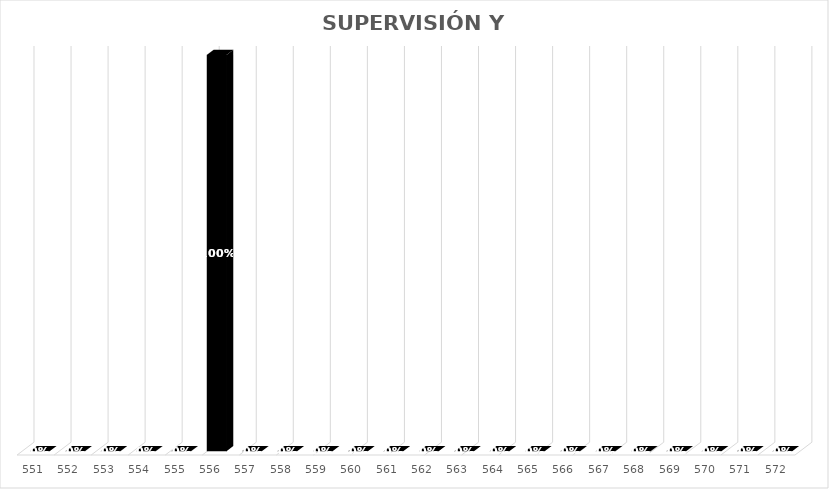
| Category | % Avance |
|---|---|
| 551.0 | 0 |
| 552.0 | 0 |
| 553.0 | 0 |
| 554.0 | 0 |
| 555.0 | 0 |
| 556.0 | 1 |
| 557.0 | 0 |
| 558.0 | 0 |
| 559.0 | 0 |
| 560.0 | 0 |
| 561.0 | 0 |
| 562.0 | 0 |
| 563.0 | 0 |
| 564.0 | 0 |
| 565.0 | 0 |
| 566.0 | 0 |
| 567.0 | 0 |
| 568.0 | 0 |
| 569.0 | 0 |
| 570.0 | 0 |
| 571.0 | 0 |
| 572.0 | 0 |